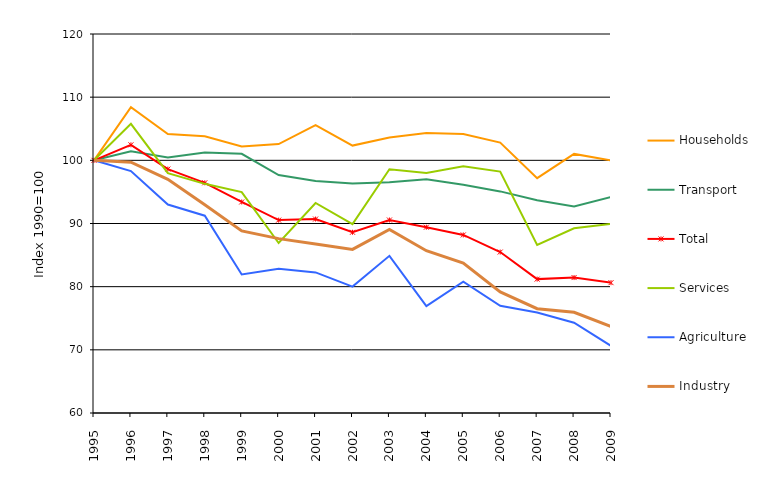
| Category | Households | Transport | Total | Services | Agriculture | Industry |
|---|---|---|---|---|---|---|
| 1995.0 | 100 | 100 | 100 | 100 | 100 | 100 |
| 1996.0 | 108.421 | 101.443 | 102.453 | 105.776 | 98.299 | 99.706 |
| 1997.0 | 104.172 | 100.465 | 98.617 | 97.979 | 93.01 | 96.996 |
| 1998.0 | 103.809 | 101.239 | 96.442 | 96.277 | 91.232 | 92.968 |
| 1999.0 | 102.182 | 101.033 | 93.408 | 94.968 | 81.928 | 88.818 |
| 2000.0 | 102.574 | 97.676 | 90.536 | 86.917 | 82.827 | 87.607 |
| 2001.0 | 105.572 | 96.725 | 90.704 | 93.25 | 82.259 | 86.755 |
| 2002.0 | 102.335 | 96.345 | 88.613 | 89.908 | 80.007 | 85.903 |
| 2003.0 | 103.605 | 96.514 | 90.55 | 98.597 | 84.882 | 89.073 |
| 2004.0 | 104.316 | 96.994 | 89.414 | 97.987 | 76.924 | 85.695 |
| 2005.0 | 104.155 | 96.138 | 88.187 | 99.057 | 80.781 | 83.737 |
| 2006.0 | 102.807 | 95.083 | 85.479 | 98.223 | 76.981 | 79.181 |
| 2007.0 | 97.175 | 93.675 | 81.196 | 86.599 | 75.912 | 76.512 |
| 2008.0 | 101.018 | 92.686 | 81.439 | 89.235 | 74.294 | 75.947 |
| 2009.0 | 99.996 | 94.206 | 80.63 | 89.944 | 70.622 | 73.707 |